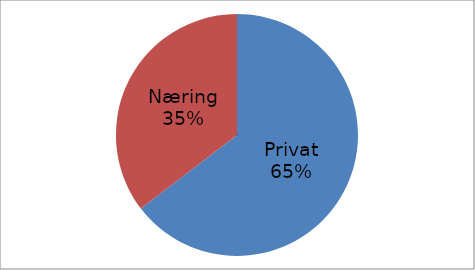
| Category | Series 0 |
|---|---|
| Privat | 36633197 |
| Næring | 20062409 |